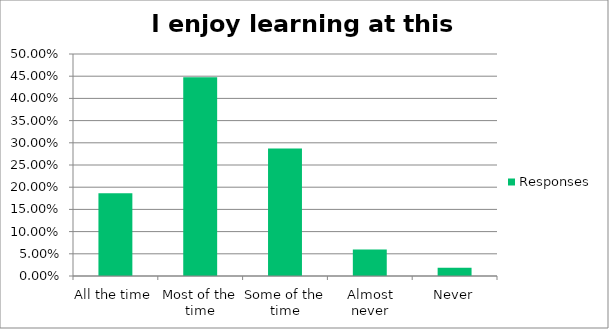
| Category | Responses |
|---|---|
| All the time | 0.187 |
| Most of the time | 0.448 |
| Some of the time | 0.287 |
| Almost never | 0.06 |
| Never | 0.019 |